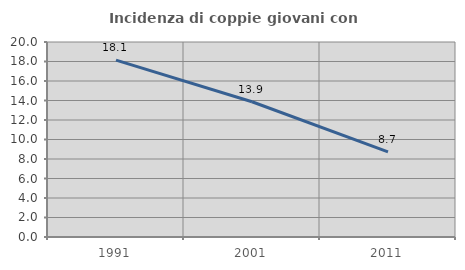
| Category | Incidenza di coppie giovani con figli |
|---|---|
| 1991.0 | 18.144 |
| 2001.0 | 13.87 |
| 2011.0 | 8.725 |